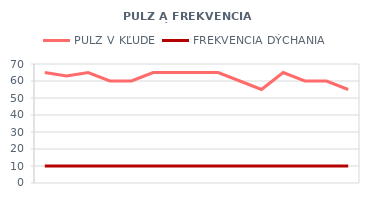
| Category | PULZ V KĽUDE | FREKVENCIA DÝCHANIA |
|---|---|---|
| 6/1/12 | 65 | 10 |
| 6/2/12 | 63 | 10 |
| 6/3/12 | 65 | 10 |
| 6/4/12 | 60 | 10 |
| 6/5/12 | 60 | 10 |
| 6/6/12 | 65 | 10 |
| 6/7/12 | 65 | 10 |
| 6/8/12 | 65 | 10 |
| 6/9/12 | 65 | 10 |
| 6/10/12 | 60 | 10 |
| 6/11/12 | 55 | 10 |
| 6/12/12 | 65 | 10 |
| 6/13/12 | 60 | 10 |
| 6/14/12 | 60 | 10 |
| 6/15/12 | 55 | 10 |